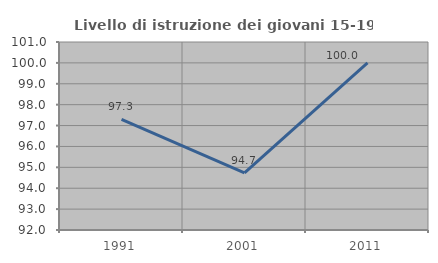
| Category | Livello di istruzione dei giovani 15-19 anni |
|---|---|
| 1991.0 | 97.297 |
| 2001.0 | 94.737 |
| 2011.0 | 100 |